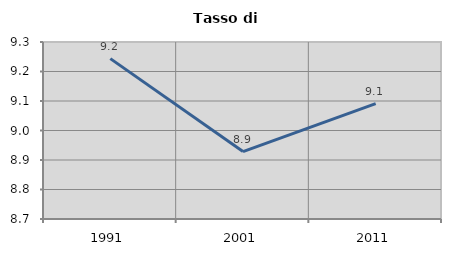
| Category | Tasso di disoccupazione   |
|---|---|
| 1991.0 | 9.244 |
| 2001.0 | 8.929 |
| 2011.0 | 9.091 |